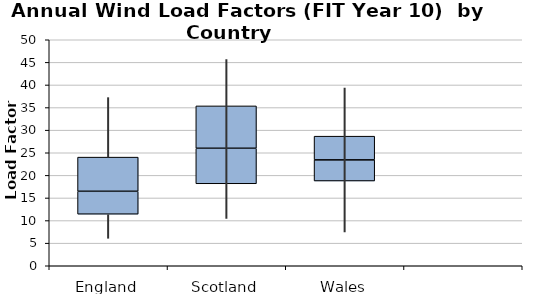
| Category | Series 0 | Series 1 | Series 2 |
|---|---|---|---|
| 0 | 11.409 | 5.068 | 7.556 |
| 1 | 18.136 | 7.857 | 9.373 |
| 2 | 18.752 | 4.677 | 5.241 |